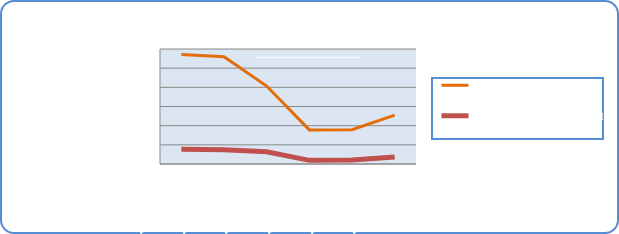
| Category | Motorin Türleri | Benzin Türleri |
|---|---|---|
| 11/25/19 | 57087821.086 | 7655102.66 |
| 11/26/19 | 55969517.811 | 7443184.219 |
| 11/27/19 | 40662011.38 | 6401207.674 |
| 11/28/19 | 17802732.379 | 1910870.482 |
| 11/29/19 | 17918344.199 | 2067210.383 |
| 11/30/19 | 25474943.821 | 3706303.617 |